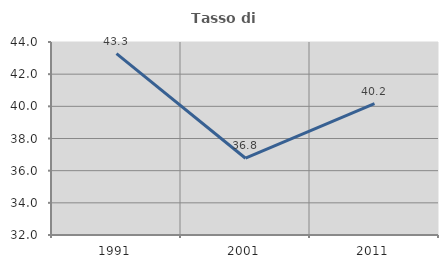
| Category | Tasso di occupazione   |
|---|---|
| 1991.0 | 43.275 |
| 2001.0 | 36.774 |
| 2011.0 | 40.173 |